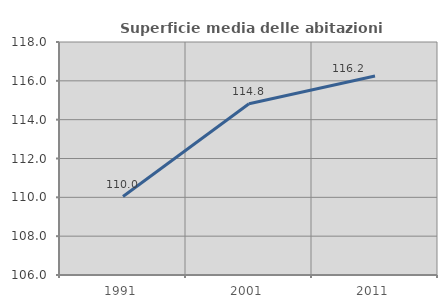
| Category | Superficie media delle abitazioni occupate |
|---|---|
| 1991.0 | 110.041 |
| 2001.0 | 114.822 |
| 2011.0 | 116.246 |